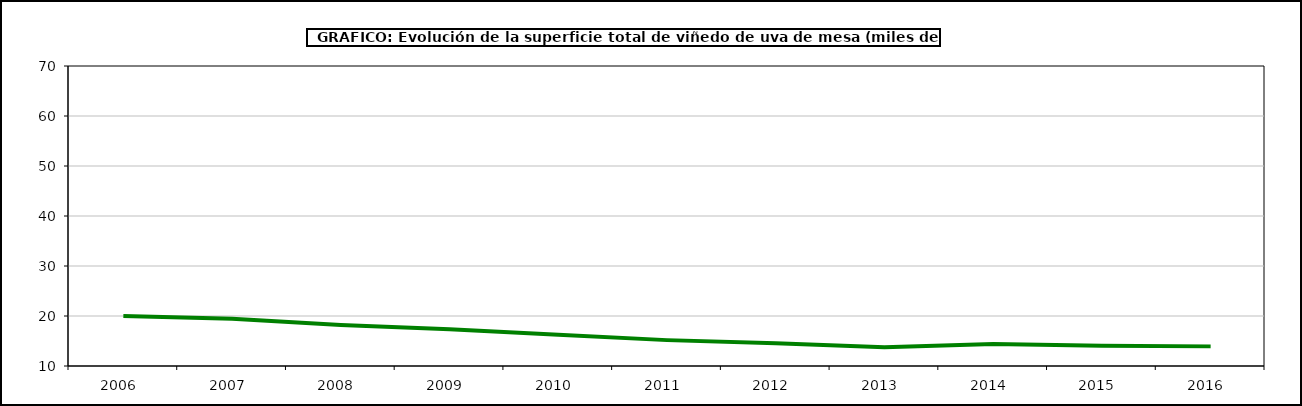
| Category | superficie |
|---|---|
| 2006.0 | 20.014 |
| 2007.0 | 19.445 |
| 2008.0 | 18.221 |
| 2009.0 | 17.362 |
| 2010.0 | 16.226 |
| 2011.0 | 15.175 |
| 2012.0 | 14.548 |
| 2013.0 | 13.742 |
| 2014.0 | 14.403 |
| 2015.0 | 14.034 |
| 2016.0 | 13.925 |